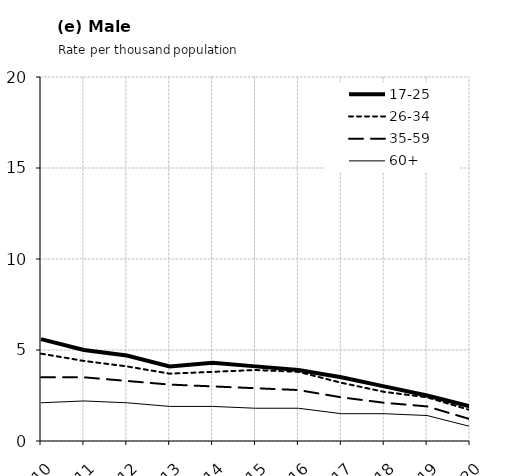
| Category | 17-25 | 26-34 | 35-59 | 60+ |
|---|---|---|---|---|
| 2010.0 | 5.6 | 4.8 | 3.5 | 2.1 |
| 2011.0 | 5 | 4.4 | 3.5 | 2.2 |
| 2012.0 | 4.7 | 4.1 | 3.3 | 2.1 |
| 2013.0 | 4.1 | 3.7 | 3.1 | 1.9 |
| 2014.0 | 4.3 | 3.8 | 3 | 1.9 |
| 2015.0 | 4.1 | 3.9 | 2.9 | 1.8 |
| 2016.0 | 3.9 | 3.8 | 2.8 | 1.8 |
| 2017.0 | 3.5 | 3.2 | 2.4 | 1.5 |
| 2018.0 | 3 | 2.7 | 2.1 | 1.5 |
| 2019.0 | 2.5 | 2.4 | 1.9 | 1.4 |
| 2020.0 | 1.9 | 1.7 | 1.2 | 0.8 |